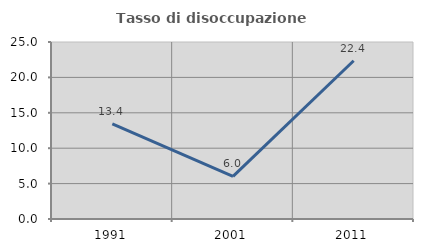
| Category | Tasso di disoccupazione giovanile  |
|---|---|
| 1991.0 | 13.437 |
| 2001.0 | 6.032 |
| 2011.0 | 22.355 |